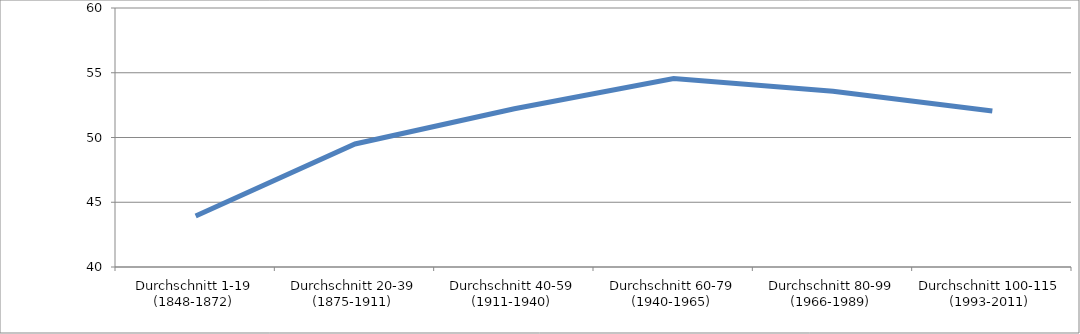
| Category | Series 0 |
|---|---|
| Durchschnitt 1-19 (1848-1872) | 43.935 |
| Durchschnitt 20-39 (1875-1911) | 49.498 |
| Durchschnitt 40-59 (1911-1940) | 52.221 |
| Durchschnitt 60-79 (1940-1965) | 54.549 |
| Durchschnitt 80-99 (1966-1989) | 53.578 |
| Durchschnitt 100-115 (1993-2011) | 52.045 |